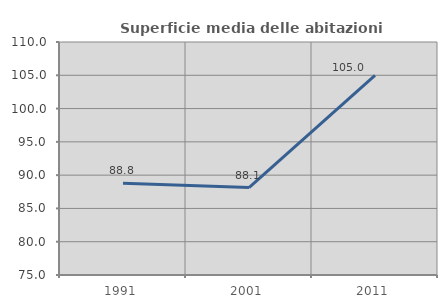
| Category | Superficie media delle abitazioni occupate |
|---|---|
| 1991.0 | 88.77 |
| 2001.0 | 88.13 |
| 2011.0 | 104.969 |